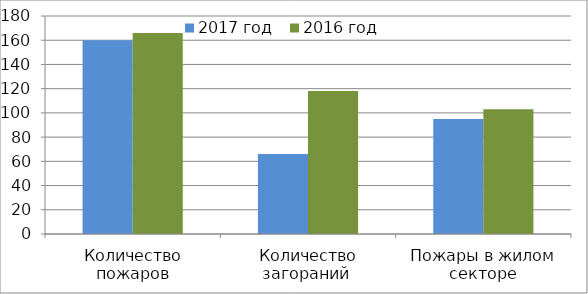
| Category | 2017 год | 2016 год |
|---|---|---|
| Количество пожаров | 160 | 166 |
| Количество загораний  | 66 | 118 |
| Пожары в жилом секторе | 95 | 103 |